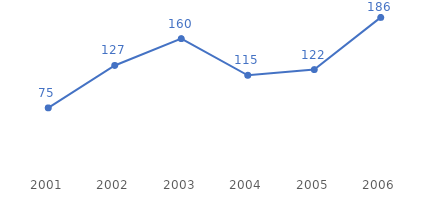
| Category | Product 4 |
|---|---|
| 2001.0 | 75 |
| 2002.0 | 127 |
| 2003.0 | 160 |
| 2004.0 | 115 |
| 2005.0 | 122 |
| 2006.0 | 186 |